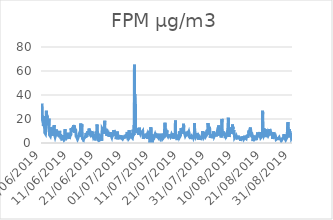
| Category | FPM |
|---|---|
| 01/06/2019 | 33 |
| 01/06/2019 | 28.8 |
| 01/06/2019 | 27.8 |
| 01/06/2019 | 22.1 |
| 01/06/2019 | 20 |
| 01/06/2019 | 18.8 |
| 01/06/2019 | 19.4 |
| 01/06/2019 | 20 |
| 01/06/2019 | 20.7 |
| 01/06/2019 | 17.9 |
| 01/06/2019 | 15 |
| 01/06/2019 | 14.5 |
| 01/06/2019 | 14.1 |
| 01/06/2019 | 14.8 |
| 01/06/2019 | 15.9 |
| 01/06/2019 | 16.6 |
| 01/06/2019 | 16.5 |
| 01/06/2019 | 17.1 |
| 01/06/2019 | 19.7 |
| 01/06/2019 | 20.4 |
| 01/06/2019 | 22.2 |
| 01/06/2019 | 17.9 |
| 01/06/2019 | 13.1 |
| 01/06/2019 | 11.6 |
| 02/06/2019 | 8.6 |
| 02/06/2019 | 7.8 |
| 02/06/2019 | 8.2 |
| 02/06/2019 | 9.4 |
| 02/06/2019 | 9.2 |
| 02/06/2019 | 8.2 |
| 02/06/2019 | 7.7 |
| 02/06/2019 | 8.7 |
| 02/06/2019 | 9.6 |
| 02/06/2019 | 10.2 |
| 02/06/2019 | 10 |
| 02/06/2019 | 12.8 |
| 02/06/2019 | 14.6 |
| 02/06/2019 | 18.4 |
| 02/06/2019 | 26.9 |
| 02/06/2019 | 25.3 |
| 02/06/2019 | 24.2 |
| 02/06/2019 | 22.9 |
| 02/06/2019 | 22.1 |
| 02/06/2019 | 21.6 |
| 02/06/2019 | 22.8 |
| 02/06/2019 | 22 |
| 02/06/2019 | 20.1 |
| 02/06/2019 | 19.1 |
| 03/06/2019 | 16 |
| 03/06/2019 | 15.2 |
| 03/06/2019 | 15.2 |
| 03/06/2019 | 15.3 |
| 03/06/2019 | 14.9 |
| 03/06/2019 | 14.8 |
| 03/06/2019 | 14.7 |
| 03/06/2019 | 14.7 |
| 03/06/2019 | 15.3 |
| 03/06/2019 | 14.3 |
| 03/06/2019 | 15 |
| 03/06/2019 | 18.9 |
| 03/06/2019 | 20.3 |
| 03/06/2019 | 14.6 |
| 03/06/2019 | 12.7 |
| 03/06/2019 | 13.3 |
| 03/06/2019 | 10.1 |
| 03/06/2019 | 8.6 |
| 03/06/2019 | 6.7 |
| 03/06/2019 | 6.5 |
| 03/06/2019 | 6.3 |
| 03/06/2019 | 6.5 |
| 03/06/2019 | 7.1 |
| 03/06/2019 | 7.4 |
| 04/06/2019 | 6.5 |
| 04/06/2019 | 5.7 |
| 04/06/2019 | 5.7 |
| 04/06/2019 | 6.6 |
| 04/06/2019 | 7.8 |
| 04/06/2019 | 11.2 |
| 04/06/2019 | 13.3 |
| 04/06/2019 | 13.5 |
| 04/06/2019 | 13.5 |
| 04/06/2019 | 11.9 |
| 04/06/2019 | 11 |
| 04/06/2019 | 10.7 |
| 04/06/2019 | 11.4 |
| 04/06/2019 | 8.5 |
| 04/06/2019 | 8.2 |
| 04/06/2019 | 10.9 |
| 04/06/2019 | 8.5 |
| 04/06/2019 | 7.4 |
| 04/06/2019 | 6.8 |
| 04/06/2019 | 6.1 |
| 04/06/2019 | 7 |
| 04/06/2019 | 6.9 |
| 04/06/2019 | 6.6 |
| 04/06/2019 | 6.7 |
| 05/06/2019 | 8.4 |
| 05/06/2019 | 12.5 |
| 05/06/2019 | 10.1 |
| 05/06/2019 | 9 |
| 05/06/2019 | 9.2 |
| 05/06/2019 | 9.1 |
| 05/06/2019 | 10.6 |
| 05/06/2019 | 11.1 |
| 05/06/2019 | 10.5 |
| 05/06/2019 | 10.4 |
| 05/06/2019 | 10.5 |
| 05/06/2019 | 14.9 |
| 05/06/2019 | 13.5 |
| 05/06/2019 | 9.4 |
| 05/06/2019 | 8.3 |
| 05/06/2019 | 7.4 |
| 05/06/2019 | 6.2 |
| 05/06/2019 | 5.7 |
| 05/06/2019 | 5.5 |
| 05/06/2019 | 5.1 |
| 05/06/2019 | 5.1 |
| 05/06/2019 | 5.8 |
| 05/06/2019 | 6.1 |
| 05/06/2019 | 6.5 |
| 06/06/2019 | 5.8 |
| 06/06/2019 | 6.1 |
| 06/06/2019 | 6.1 |
| 06/06/2019 | 6.4 |
| 06/06/2019 | 7.2 |
| 06/06/2019 | 8.6 |
| 06/06/2019 | 11.2 |
| 06/06/2019 | 12 |
| 06/06/2019 | 9.6 |
| 06/06/2019 | 7.1 |
| 06/06/2019 | 6.6 |
| 06/06/2019 | 6.9 |
| 06/06/2019 | 6.7 |
| 06/06/2019 | 7.3 |
| 06/06/2019 | 7.8 |
| 06/06/2019 | 7.6 |
| 06/06/2019 | 7.4 |
| 06/06/2019 | 6.7 |
| 06/06/2019 | 6.6 |
| 06/06/2019 | 7.8 |
| 06/06/2019 | 8 |
| 06/06/2019 | 7.3 |
| 06/06/2019 | 6.9 |
| 06/06/2019 | 6.5 |
| 07/06/2019 | 6.8 |
| 07/06/2019 | 9 |
| 07/06/2019 | 8.4 |
| 07/06/2019 | 7.6 |
| 07/06/2019 | 7.1 |
| 07/06/2019 | 7.7 |
| 07/06/2019 | 8.8 |
| 07/06/2019 | 8.2 |
| 07/06/2019 | 9.5 |
| 07/06/2019 | 8.5 |
| 07/06/2019 | 9.1 |
| 07/06/2019 | 10.1 |
| 07/06/2019 | 8.5 |
| 07/06/2019 | 5.7 |
| 07/06/2019 | 4.7 |
| 07/06/2019 | 4.5 |
| 07/06/2019 | 5.9 |
| 07/06/2019 | 7.4 |
| 07/06/2019 | 7.6 |
| 07/06/2019 | 6.3 |
| 07/06/2019 | 6.4 |
| 07/06/2019 | 5.7 |
| 07/06/2019 | 4.4 |
| 07/06/2019 | 3.2 |
| 08/06/2019 | 2.6 |
| 08/06/2019 | 2.8 |
| 08/06/2019 | 2.8 |
| 08/06/2019 | 4.1 |
| 08/06/2019 | 3.9 |
| 08/06/2019 | 3.2 |
| 08/06/2019 | 2.4 |
| 08/06/2019 | 2.6 |
| 08/06/2019 | 2.6 |
| 08/06/2019 | 3.6 |
| 08/06/2019 | 3.3 |
| 08/06/2019 | 3.6 |
| 08/06/2019 | 3.3 |
| 08/06/2019 | 3.2 |
| 08/06/2019 | 3.5 |
| 08/06/2019 | 4.2 |
| 08/06/2019 | 6.6 |
| 08/06/2019 | 4.8 |
| 08/06/2019 | 4.9 |
| 08/06/2019 | 5.2 |
| 08/06/2019 | 4.3 |
| 08/06/2019 | 3.7 |
| 08/06/2019 | 3.4 |
| 08/06/2019 | 3.2 |
| 09/06/2019 | 3.1 |
| 09/06/2019 | 2.7 |
| 09/06/2019 | 2.3 |
| 09/06/2019 | 2.6 |
| 09/06/2019 | 3.1 |
| 09/06/2019 | 2.9 |
| 09/06/2019 | 3.5 |
| 09/06/2019 | 3.7 |
| 09/06/2019 | 5.1 |
| 09/06/2019 | 11.5 |
| 09/06/2019 | 12.2 |
| 09/06/2019 | 10.6 |
| 09/06/2019 | 7.8 |
| 09/06/2019 | 7.4 |
| 09/06/2019 | 7.2 |
| 09/06/2019 | 7.1 |
| 09/06/2019 | 6.8 |
| 09/06/2019 | 6.6 |
| 09/06/2019 | 6.5 |
| 09/06/2019 | 6.4 |
| 09/06/2019 | 7.6 |
| 09/06/2019 | 7 |
| 09/06/2019 | 6.1 |
| 09/06/2019 | 4.1 |
| 10/06/2019 | 4.1 |
| 10/06/2019 | 4.2 |
| 10/06/2019 | 4.4 |
| 10/06/2019 | 3.8 |
| 10/06/2019 | 3.7 |
| 10/06/2019 | 3.7 |
| 10/06/2019 | 4.7 |
| 10/06/2019 | 5.1 |
| 10/06/2019 | 5.3 |
| 10/06/2019 | 8.5 |
| 10/06/2019 | 5.3 |
| 10/06/2019 | 4.8 |
| 10/06/2019 | 4.2 |
| 10/06/2019 | 4.2 |
| 10/06/2019 | 4.7 |
| 10/06/2019 | 4.3 |
| 10/06/2019 | 4.1 |
| 10/06/2019 | 4.6 |
| 10/06/2019 | 4.7 |
| 10/06/2019 | 6.1 |
| 10/06/2019 | 5.3 |
| 10/06/2019 | 4.4 |
| 10/06/2019 | 4.2 |
| 10/06/2019 | 3.4 |
| 11/06/2019 | 3.8 |
| 11/06/2019 | 4.2 |
| 11/06/2019 | 4.4 |
| 11/06/2019 | 4 |
| 11/06/2019 | 4.3 |
| 11/06/2019 | 4.7 |
| 11/06/2019 | 5.5 |
| 11/06/2019 | 6.5 |
| 11/06/2019 | 7.3 |
| 11/06/2019 | 6.8 |
| 11/06/2019 | 7.4 |
| 11/06/2019 | 6.2 |
| 11/06/2019 | 5.5 |
| 11/06/2019 | 8.4 |
| 11/06/2019 | 8.6 |
| 11/06/2019 | 8.7 |
| 11/06/2019 | 12.2 |
| 11/06/2019 | 11.2 |
| 11/06/2019 | 12.2 |
| 11/06/2019 | 10.9 |
| 11/06/2019 | 10.8 |
| 11/06/2019 | 9.3 |
| 11/06/2019 | 8.9 |
| 11/06/2019 | 9.5 |
| 12/06/2019 | 10.5 |
| 12/06/2019 | 10.8 |
| 12/06/2019 | 11.4 |
| 12/06/2019 | 11.8 |
| 12/06/2019 | 12.2 |
| 12/06/2019 | 12.9 |
| 12/06/2019 | 13.3 |
| 12/06/2019 | 12.9 |
| 12/06/2019 | 12.5 |
| 12/06/2019 | 11.8 |
| 12/06/2019 | 11.6 |
| 12/06/2019 | 13.6 |
| 12/06/2019 | 13.7 |
| 12/06/2019 | 12.5 |
| 12/06/2019 | 13.2 |
| 12/06/2019 | 14.7 |
| 12/06/2019 | 12.1 |
| 12/06/2019 | 14.6 |
| 12/06/2019 | 10.2 |
| 12/06/2019 | 8.6 |
| 12/06/2019 | 9.9 |
| 12/06/2019 | 9.3 |
| 12/06/2019 | 9.8 |
| 12/06/2019 | 10.2 |
| 13/06/2019 | 10.8 |
| 13/06/2019 | 11.9 |
| 13/06/2019 | 12 |
| 13/06/2019 | 12.3 |
| 13/06/2019 | 12.1 |
| 13/06/2019 | 11.7 |
| 13/06/2019 | 12.1 |
| 13/06/2019 | 12.1 |
| 13/06/2019 | 10.8 |
| 13/06/2019 | 10 |
| 13/06/2019 | 7.7 |
| 13/06/2019 | 6.7 |
| 13/06/2019 | 6.3 |
| 13/06/2019 | 4.9 |
| 13/06/2019 | 5 |
| 13/06/2019 | 4.4 |
| 13/06/2019 | 4.2 |
| 13/06/2019 | 4.6 |
| 13/06/2019 | 4.9 |
| 13/06/2019 | 6.7 |
| 13/06/2019 | 4.2 |
| 13/06/2019 | 3.9 |
| 13/06/2019 | 4 |
| 13/06/2019 | 4 |
| 14/06/2019 | 3.2 |
| 14/06/2019 | 3.2 |
| 14/06/2019 | 2.9 |
| 14/06/2019 | 3.3 |
| 14/06/2019 | 3.8 |
| 14/06/2019 | 4.4 |
| 14/06/2019 | 4.7 |
| 14/06/2019 | 5.2 |
| 14/06/2019 | 4.2 |
| 14/06/2019 | 4 |
| 14/06/2019 | 4.2 |
| 14/06/2019 | 6.1 |
| 14/06/2019 | 5.5 |
| 14/06/2019 | 5.2 |
| 14/06/2019 | 5.9 |
| 14/06/2019 | 5 |
| 14/06/2019 | 5.3 |
| 14/06/2019 | 6.7 |
| 14/06/2019 | 5.5 |
| 14/06/2019 | 6.1 |
| 14/06/2019 | 6.3 |
| 14/06/2019 | 7.9 |
| 14/06/2019 | 8.4 |
| 14/06/2019 | 5.6 |
| 15/06/2019 | 7.1 |
| 15/06/2019 | 9.5 |
| 15/06/2019 | 11 |
| 15/06/2019 | 13.8 |
| 15/06/2019 | 16.3 |
| 15/06/2019 | 12.8 |
| 15/06/2019 | 11.7 |
| 15/06/2019 | 12.7 |
| 15/06/2019 | 14.7 |
| 15/06/2019 | 13.1 |
| 15/06/2019 | 12.2 |
| 15/06/2019 | 9.9 |
| 15/06/2019 | 9.4 |
| 15/06/2019 | 15.6 |
| 15/06/2019 | 13.4 |
| 15/06/2019 | 12.1 |
| 15/06/2019 | 10.6 |
| 15/06/2019 | 7.4 |
| 15/06/2019 | 6 |
| 15/06/2019 | 3.7 |
| 15/06/2019 | 3.4 |
| 15/06/2019 | 4.3 |
| 15/06/2019 | 4.2 |
| 15/06/2019 | 4.1 |
| 16/06/2019 | 3.7 |
| 16/06/2019 | 3.7 |
| 16/06/2019 | 3.3 |
| 16/06/2019 | 2.8 |
| 16/06/2019 | 2.7 |
| 16/06/2019 | 3.4 |
| 16/06/2019 | 5 |
| 16/06/2019 | 3.6 |
| 16/06/2019 | 4 |
| 16/06/2019 | 3.5 |
| 16/06/2019 | 3.3 |
| 16/06/2019 | 3.6 |
| 16/06/2019 | 3.5 |
| 16/06/2019 | 3.6 |
| 16/06/2019 | 3.8 |
| 16/06/2019 | 4.5 |
| 16/06/2019 | 4.4 |
| 16/06/2019 | 4.9 |
| 16/06/2019 | 5.2 |
| 16/06/2019 | 4.9 |
| 16/06/2019 | 4.7 |
| 16/06/2019 | 5 |
| 16/06/2019 | 5.4 |
| 16/06/2019 | 4.6 |
| 17/06/2019 | 4.2 |
| 17/06/2019 | 5.3 |
| 17/06/2019 | 8.1 |
| 17/06/2019 | 8.2 |
| 17/06/2019 | 8.1 |
| 17/06/2019 | 7.2 |
| 17/06/2019 | 8.4 |
| 17/06/2019 | 7.8 |
| 17/06/2019 | 6.1 |
| 17/06/2019 | 5.2 |
| 17/06/2019 | 5 |
| 17/06/2019 | 5.9 |
| 17/06/2019 | 6.5 |
| 17/06/2019 | 6.3 |
| 17/06/2019 | 7.1 |
| 17/06/2019 | 7.8 |
| 17/06/2019 | 7.5 |
| 17/06/2019 | 7.3 |
| 17/06/2019 | 8.5 |
| 17/06/2019 | 9.8 |
| 17/06/2019 | 7.2 |
| 17/06/2019 | 7.2 |
| 17/06/2019 | 7.8 |
| 17/06/2019 | 8.1 |
| 18/06/2019 | 9.3 |
| 18/06/2019 | 7.7 |
| 18/06/2019 | 6.7 |
| 18/06/2019 | 8.1 |
| 18/06/2019 | 8.1 |
| 18/06/2019 | 10.2 |
| 18/06/2019 | 12 |
| 18/06/2019 | 11.4 |
| 18/06/2019 | 7.8 |
| 18/06/2019 | 7.3 |
| 18/06/2019 | 8.3 |
| 18/06/2019 | 8.2 |
| 18/06/2019 | 7.9 |
| 18/06/2019 | 7.9 |
| 18/06/2019 | 8 |
| 18/06/2019 | 6.9 |
| 18/06/2019 | 6.9 |
| 18/06/2019 | 6.7 |
| 18/06/2019 | 7.3 |
| 18/06/2019 | 8.9 |
| 18/06/2019 | 9.7 |
| 18/06/2019 | 9.5 |
| 18/06/2019 | 8.7 |
| 18/06/2019 | 8.5 |
| 19/06/2019 | 8 |
| 19/06/2019 | 8.6 |
| 19/06/2019 | 8.9 |
| 19/06/2019 | 8.9 |
| 19/06/2019 | 9.1 |
| 19/06/2019 | 9 |
| 19/06/2019 | 10 |
| 19/06/2019 | 10.3 |
| 19/06/2019 | 8.1 |
| 19/06/2019 | 7.2 |
| 19/06/2019 | 8 |
| 19/06/2019 | 7.3 |
| 19/06/2019 | 7.4 |
| 19/06/2019 | 7.2 |
| 19/06/2019 | 8.8 |
| 19/06/2019 | 7.6 |
| 19/06/2019 | 6.7 |
| 19/06/2019 | 6.6 |
| 19/06/2019 | 5.8 |
| 19/06/2019 | 5.1 |
| 19/06/2019 | 5.2 |
| 19/06/2019 | 6.1 |
| 19/06/2019 | 6.8 |
| 19/06/2019 | 5.2 |
| 20/06/2019 | 4.3 |
| 20/06/2019 | 4.2 |
| 20/06/2019 | 4 |
| 20/06/2019 | 3.7 |
| 20/06/2019 | 5.1 |
| 20/06/2019 | 5.8 |
| 20/06/2019 | 7.3 |
| 20/06/2019 | 5.4 |
| 20/06/2019 | 3.2 |
| 20/06/2019 | 2.2 |
| 20/06/2019 | 1.8 |
| 20/06/2019 | 2 |
| 20/06/2019 | 2.9 |
| 20/06/2019 | 3 |
| 20/06/2019 | 4.6 |
| 20/06/2019 | 5.7 |
| 20/06/2019 | 5.4 |
| 20/06/2019 | 5.4 |
| 20/06/2019 | 6.1 |
| 20/06/2019 | 5.7 |
| 20/06/2019 | 6 |
| 20/06/2019 | 9.6 |
| 20/06/2019 | 8.4 |
| 20/06/2019 | 5.6 |
| 21/06/2019 | 5.5 |
| 21/06/2019 | 5.4 |
| 21/06/2019 | 6.4 |
| 21/06/2019 | 8.1 |
| 21/06/2019 | 15.4 |
| 21/06/2019 | 14 |
| 21/06/2019 | 10.8 |
| 21/06/2019 | 9.5 |
| 21/06/2019 | 6.6 |
| 21/06/2019 | 7.2 |
| 21/06/2019 | 8.3 |
| 21/06/2019 | 8.5 |
| 21/06/2019 | 7.7 |
| 21/06/2019 | 6.6 |
| 21/06/2019 | 7.5 |
| 21/06/2019 | 6.2 |
| 21/06/2019 | 3.5 |
| 21/06/2019 | 1.5 |
| 21/06/2019 | 2 |
| 21/06/2019 | 2.7 |
| 21/06/2019 | 3.7 |
| 21/06/2019 | 3.8 |
| 21/06/2019 | 2.3 |
| 21/06/2019 | 2.1 |
| 22/06/2019 | 2.2 |
| 22/06/2019 | 2.3 |
| 22/06/2019 | 2.6 |
| 22/06/2019 | 2.6 |
| 22/06/2019 | 2.4 |
| 22/06/2019 | 2.5 |
| 22/06/2019 | 2.4 |
| 22/06/2019 | 2.7 |
| 22/06/2019 | 2.5 |
| 22/06/2019 | 2.4 |
| 22/06/2019 | 2.9 |
| 22/06/2019 | 4.3 |
| 22/06/2019 | 4.5 |
| 22/06/2019 | 4.2 |
| 22/06/2019 | 3.8 |
| 22/06/2019 | 3.4 |
| 22/06/2019 | 5.3 |
| 22/06/2019 | 6.7 |
| 22/06/2019 | 4.1 |
| 22/06/2019 | 4 |
| 22/06/2019 | 1.9 |
| 22/06/2019 | 2.1 |
| 22/06/2019 | 4.8 |
| 22/06/2019 | 6.6 |
| 23/06/2019 | 9.1 |
| 23/06/2019 | 11.8 |
| 23/06/2019 | 12 |
| 23/06/2019 | 12.1 |
| 23/06/2019 | 12.5 |
| 23/06/2019 | 12.1 |
| 23/06/2019 | 12 |
| 23/06/2019 | 11.8 |
| 23/06/2019 | 10.7 |
| 23/06/2019 | 10 |
| 23/06/2019 | 8.8 |
| 23/06/2019 | 7.7 |
| 23/06/2019 | 8.4 |
| 23/06/2019 | 10.5 |
| 23/06/2019 | 11.6 |
| 23/06/2019 | 11.7 |
| 23/06/2019 | 11.9 |
| 23/06/2019 | 11.2 |
| 23/06/2019 | 10.3 |
| 23/06/2019 | 9.9 |
| 23/06/2019 | 11.7 |
| 23/06/2019 | 12 |
| 23/06/2019 | 16.7 |
| 23/06/2019 | 18.5 |
| 24/06/2019 | 15 |
| 24/06/2019 | 11.6 |
| 24/06/2019 | 10.3 |
| 24/06/2019 | 10.4 |
| 24/06/2019 | 10.4 |
| 24/06/2019 | 8.3 |
| 24/06/2019 | 8.6 |
| 24/06/2019 | 10.6 |
| 24/06/2019 | 9.7 |
| 24/06/2019 | 9.9 |
| 24/06/2019 | 7.9 |
| 24/06/2019 | 8.3 |
| 24/06/2019 | 9.7 |
| 24/06/2019 | 11.8 |
| 24/06/2019 | 9.4 |
| 24/06/2019 | 8.3 |
| 24/06/2019 | 7.2 |
| 24/06/2019 | 5.9 |
| 24/06/2019 | 5.5 |
| 24/06/2019 | 6.4 |
| 24/06/2019 | 6.5 |
| 24/06/2019 | 6.6 |
| 24/06/2019 | 6.6 |
| 24/06/2019 | 7.7 |
| 25/06/2019 | 8.4 |
| 25/06/2019 | 8.4 |
| 25/06/2019 | 7.5 |
| 25/06/2019 | 7 |
| 25/06/2019 | 6.7 |
| 25/06/2019 | 6.2 |
| 25/06/2019 | 5.8 |
| 25/06/2019 | 5.6 |
| 25/06/2019 | 6.2 |
| 25/06/2019 | 6.6 |
| 25/06/2019 | 7.1 |
| 25/06/2019 | 7.7 |
| 25/06/2019 | 6.8 |
| 25/06/2019 | 6.5 |
| 25/06/2019 | 7 |
| 25/06/2019 | 5.3 |
| 25/06/2019 | 5 |
| 25/06/2019 | 4.8 |
| 25/06/2019 | 5.5 |
| 25/06/2019 | 5.1 |
| 25/06/2019 | 5.7 |
| 25/06/2019 | 8.8 |
| 25/06/2019 | 8.5 |
| 25/06/2019 | 7.9 |
| 26/06/2019 | 7.8 |
| 26/06/2019 | 7.4 |
| 26/06/2019 | 5.7 |
| 26/06/2019 | 6.6 |
| 26/06/2019 | 8.9 |
| 26/06/2019 | 6.7 |
| 26/06/2019 | 7 |
| 26/06/2019 | 7.2 |
| 26/06/2019 | 8 |
| 26/06/2019 | 5.7 |
| 26/06/2019 | 5.1 |
| 26/06/2019 | 5.1 |
| 26/06/2019 | 5.1 |
| 26/06/2019 | 4.8 |
| 26/06/2019 | 5.1 |
| 26/06/2019 | 5.7 |
| 26/06/2019 | 5.5 |
| 26/06/2019 | 4.9 |
| 26/06/2019 | 5.4 |
| 26/06/2019 | 6.4 |
| 26/06/2019 | 7.3 |
| 26/06/2019 | 8.5 |
| 26/06/2019 | 8.9 |
| 26/06/2019 | 8.7 |
| 27/06/2019 | 8.1 |
| 27/06/2019 | 7 |
| 27/06/2019 | 7.6 |
| 27/06/2019 | 6.7 |
| 27/06/2019 | 6.8 |
| 27/06/2019 | 7 |
| 27/06/2019 | 7.3 |
| 27/06/2019 | 7.9 |
| 27/06/2019 | 10.9 |
| 27/06/2019 | 9 |
| 27/06/2019 | 9.6 |
| 27/06/2019 | 10.2 |
| 27/06/2019 | 10.2 |
| 27/06/2019 | 8.1 |
| 27/06/2019 | 7.1 |
| 27/06/2019 | 6.4 |
| 27/06/2019 | 6.2 |
| 27/06/2019 | 7.2 |
| 27/06/2019 | 6.8 |
| 27/06/2019 | 7.4 |
| 27/06/2019 | 7.6 |
| 27/06/2019 | 8.3 |
| 27/06/2019 | 7.3 |
| 27/06/2019 | 7 |
| 28/06/2019 | 7 |
| 28/06/2019 | 6.4 |
| 28/06/2019 | 6.3 |
| 28/06/2019 | 3.2 |
| 28/06/2019 | 3.8 |
| 28/06/2019 | 3.4 |
| 28/06/2019 | 3.9 |
| 28/06/2019 | 4.4 |
| 28/06/2019 | 5.2 |
| 28/06/2019 | 6 |
| 28/06/2019 | 4.9 |
| 28/06/2019 | 5.1 |
| 28/06/2019 | 5.3 |
| 28/06/2019 | 5.3 |
| 28/06/2019 | 5.8 |
| 28/06/2019 | 6.4 |
| 28/06/2019 | 9.5 |
| 28/06/2019 | 5.3 |
| 28/06/2019 | 5 |
| 28/06/2019 | 5.3 |
| 28/06/2019 | 5.3 |
| 28/06/2019 | 5.4 |
| 28/06/2019 | 5 |
| 28/06/2019 | 4.8 |
| 29/06/2019 | 4.5 |
| 29/06/2019 | 4.7 |
| 29/06/2019 | 5.5 |
| 29/06/2019 | 4.7 |
| 29/06/2019 | 4 |
| 29/06/2019 | 4.3 |
| 29/06/2019 | 3.3 |
| 29/06/2019 | 3.1 |
| 29/06/2019 | 3.7 |
| 29/06/2019 | 6.1 |
| 29/06/2019 | 6.9 |
| 29/06/2019 | 4.8 |
| 29/06/2019 | 4.4 |
| 29/06/2019 | 3.5 |
| 29/06/2019 | 4.1 |
| 29/06/2019 | 4.2 |
| 29/06/2019 | 4 |
| 29/06/2019 | 4.8 |
| 29/06/2019 | 5.1 |
| 29/06/2019 | 4.7 |
| 29/06/2019 | 4.3 |
| 29/06/2019 | 4.3 |
| 29/06/2019 | 4.1 |
| 29/06/2019 | 5 |
| 30/06/2019 | 6.5 |
| 30/06/2019 | 4.2 |
| 30/06/2019 | 4.3 |
| 30/06/2019 | 4.5 |
| 30/06/2019 | 4.3 |
| 30/06/2019 | 4.3 |
| 30/06/2019 | 3.8 |
| 30/06/2019 | 3.8 |
| 30/06/2019 | 3.6 |
| 30/06/2019 | 3.6 |
| 30/06/2019 | 3.5 |
| 30/06/2019 | 3.4 |
| 30/06/2019 | 3.3 |
| 30/06/2019 | 3.3 |
| 30/06/2019 | 3 |
| 30/06/2019 | 3.2 |
| 30/06/2019 | 5.4 |
| 30/06/2019 | 3.6 |
| 30/06/2019 | 3.7 |
| 30/06/2019 | 5.5 |
| 30/06/2019 | 4.5 |
| 30/06/2019 | 3.8 |
| 30/06/2019 | 3.8 |
| 30/06/2019 | 4 |
| 01/07/2019 | 4.7 |
| 01/07/2019 | 5.1 |
| 01/07/2019 | 5.3 |
| 01/07/2019 | 5.4 |
| 01/07/2019 | 5.1 |
| 01/07/2019 | 5.5 |
| 01/07/2019 | 5.5 |
| 01/07/2019 | 6 |
| 01/07/2019 | 6 |
| 01/07/2019 | 6.1 |
| 01/07/2019 | 5.8 |
| 01/07/2019 | 5.4 |
| 01/07/2019 | 5 |
| 01/07/2019 | 4.9 |
| 01/07/2019 | 4.9 |
| 01/07/2019 | 5.6 |
| 01/07/2019 | 5.3 |
| 01/07/2019 | 5.6 |
| 01/07/2019 | 5.8 |
| 01/07/2019 | 6.3 |
| 01/07/2019 | 7.2 |
| 01/07/2019 | 7.9 |
| 01/07/2019 | 5.5 |
| 01/07/2019 | 6 |
| 02/07/2019 | 6.2 |
| 02/07/2019 | 6.1 |
| 02/07/2019 | 6.4 |
| 02/07/2019 | 6.1 |
| 02/07/2019 | 6.5 |
| 02/07/2019 | 8.3 |
| 02/07/2019 | 9.2 |
| 02/07/2019 | 5 |
| 02/07/2019 | 4.9 |
| 02/07/2019 | 4.2 |
| 02/07/2019 | 4 |
| 02/07/2019 | 3.7 |
| 02/07/2019 | 3.3 |
| 02/07/2019 | 3.6 |
| 02/07/2019 | 4 |
| 02/07/2019 | 3.8 |
| 02/07/2019 | 4.1 |
| 02/07/2019 | 4.5 |
| 02/07/2019 | 4.5 |
| 02/07/2019 | 4.8 |
| 02/07/2019 | 4.9 |
| 02/07/2019 | 6.8 |
| 02/07/2019 | 10.7 |
| 02/07/2019 | 4.2 |
| 03/07/2019 | 4.4 |
| 03/07/2019 | 4.6 |
| 03/07/2019 | 4.4 |
| 03/07/2019 | 4.1 |
| 03/07/2019 | 4.2 |
| 03/07/2019 | 4.1 |
| 03/07/2019 | 4.4 |
| 03/07/2019 | 4.7 |
| 03/07/2019 | 5.3 |
| 03/07/2019 | 5.2 |
| 03/07/2019 | 4.3 |
| 03/07/2019 | 5.7 |
| 03/07/2019 | 4.9 |
| 03/07/2019 | 5.2 |
| 03/07/2019 | 8.2 |
| 03/07/2019 | 6 |
| 03/07/2019 | 5.8 |
| 03/07/2019 | 5.3 |
| 03/07/2019 | 5.2 |
| 03/07/2019 | 5.1 |
| 03/07/2019 | 5.4 |
| 03/07/2019 | 5.2 |
| 03/07/2019 | 4.7 |
| 03/07/2019 | 4.7 |
| 04/07/2019 | 4.9 |
| 04/07/2019 | 4.4 |
| 04/07/2019 | 4.5 |
| 04/07/2019 | 4.2 |
| 04/07/2019 | 4.6 |
| 04/07/2019 | 5.2 |
| 04/07/2019 | 5.5 |
| 04/07/2019 | 6.7 |
| 04/07/2019 | 6.5 |
| 04/07/2019 | 11 |
| 04/07/2019 | 6.4 |
| 04/07/2019 | 6.2 |
| 04/07/2019 | 6.6 |
| 04/07/2019 | 6.5 |
| 04/07/2019 | 7.1 |
| 04/07/2019 | 7.8 |
| 04/07/2019 | 6.7 |
| 04/07/2019 | 7 |
| 04/07/2019 | 9.3 |
| 04/07/2019 | 15 |
| 04/07/2019 | 9.1 |
| 04/07/2019 | 65.3 |
| 04/07/2019 | 11.1 |
| 04/07/2019 | 38 |
| 05/07/2019 | 40.8 |
| 05/07/2019 | 14.7 |
| 05/07/2019 | 25 |
| 05/07/2019 | 16.6 |
| 05/07/2019 | 32.2 |
| 05/07/2019 | 22.3 |
| 05/07/2019 | 10.1 |
| 05/07/2019 | 8.9 |
| 05/07/2019 | 8.8 |
| 05/07/2019 | 8.9 |
| 05/07/2019 | 10.7 |
| 05/07/2019 | 8.3 |
| 05/07/2019 | 8.4 |
| 05/07/2019 | 9.3 |
| 05/07/2019 | 9 |
| 05/07/2019 | 9.5 |
| 05/07/2019 | 8.9 |
| 05/07/2019 | 9.3 |
| 05/07/2019 | 9.4 |
| 05/07/2019 | 8.5 |
| 05/07/2019 | 9.9 |
| 05/07/2019 | 9.3 |
| 05/07/2019 | 9.8 |
| 05/07/2019 | 12.2 |
| 06/07/2019 | 12.5 |
| 06/07/2019 | 11.2 |
| 06/07/2019 | 10.3 |
| 06/07/2019 | 9.5 |
| 06/07/2019 | 8.9 |
| 06/07/2019 | 8.6 |
| 06/07/2019 | 8.9 |
| 06/07/2019 | 8 |
| 06/07/2019 | 7.3 |
| 06/07/2019 | 6.9 |
| 06/07/2019 | 7.5 |
| 06/07/2019 | 7.4 |
| 06/07/2019 | 8.1 |
| 06/07/2019 | 9 |
| 06/07/2019 | 10.8 |
| 06/07/2019 | 11.2 |
| 06/07/2019 | 12.8 |
| 06/07/2019 | 9.3 |
| 06/07/2019 | 7.8 |
| 06/07/2019 | 7.5 |
| 06/07/2019 | 7.7 |
| 06/07/2019 | 7.7 |
| 06/07/2019 | 8.9 |
| 06/07/2019 | 8.7 |
| 07/07/2019 | 8.8 |
| 07/07/2019 | 8 |
| 07/07/2019 | 8 |
| 07/07/2019 | 8.3 |
| 07/07/2019 | 8.4 |
| 07/07/2019 | 8.6 |
| 07/07/2019 | 8.6 |
| 07/07/2019 | 9.7 |
| 07/07/2019 | 9.6 |
| 07/07/2019 | 8.6 |
| 07/07/2019 | 8.5 |
| 07/07/2019 | 7.5 |
| 07/07/2019 | 8 |
| 07/07/2019 | 8.9 |
| 07/07/2019 | 8.9 |
| 07/07/2019 | 9.2 |
| 07/07/2019 | 9.1 |
| 07/07/2019 | 9.2 |
| 07/07/2019 | 9 |
| 07/07/2019 | 9.2 |
| 07/07/2019 | 9.4 |
| 07/07/2019 | 9.9 |
| 07/07/2019 | 7.4 |
| 07/07/2019 | 6.2 |
| 08/07/2019 | 6.8 |
| 08/07/2019 | 6.5 |
| 08/07/2019 | 4.7 |
| 08/07/2019 | 3.5 |
| 08/07/2019 | 3.6 |
| 08/07/2019 | 4.2 |
| 08/07/2019 | 4.4 |
| 08/07/2019 | 4.4 |
| 08/07/2019 | 4.4 |
| 08/07/2019 | 4.5 |
| 08/07/2019 | 4.7 |
| 08/07/2019 | 5.1 |
| 08/07/2019 | 5 |
| 08/07/2019 | 5.3 |
| 08/07/2019 | 5.3 |
| 08/07/2019 | 5.5 |
| 08/07/2019 | 6 |
| 08/07/2019 | 6.7 |
| 08/07/2019 | 6.6 |
| 08/07/2019 | 6.7 |
| 08/07/2019 | 6.6 |
| 08/07/2019 | 6.5 |
| 08/07/2019 | 6.7 |
| 08/07/2019 | 6.8 |
| 09/07/2019 | 7.1 |
| 09/07/2019 | 7 |
| 09/07/2019 | 6.9 |
| 09/07/2019 | 6.3 |
| 09/07/2019 | 6.5 |
| 09/07/2019 | 6.4 |
| 09/07/2019 | 6.6 |
| 09/07/2019 | 6.6 |
| 09/07/2019 | 7 |
| 09/07/2019 | 7.1 |
| 09/07/2019 | 4.1 |
| 09/07/2019 | 6.1 |
| 09/07/2019 | 6.4 |
| 09/07/2019 | 5.9 |
| 09/07/2019 | 4.4 |
| 09/07/2019 | 3.5 |
| 09/07/2019 | 3.6 |
| 09/07/2019 | 3.9 |
| 09/07/2019 | 4 |
| 09/07/2019 | 6.7 |
| 09/07/2019 | 7.8 |
| 09/07/2019 | 8.6 |
| 09/07/2019 | 9.5 |
| 09/07/2019 | 8.2 |
| 10/07/2019 | 6.4 |
| 10/07/2019 | 8.4 |
| 10/07/2019 | 8.8 |
| 10/07/2019 | 9 |
| 10/07/2019 | 8.9 |
| 10/07/2019 | 9.1 |
| 10/07/2019 | 8.8 |
| 10/07/2019 | 8.4 |
| 10/07/2019 | 8.1 |
| 10/07/2019 | 7.5 |
| 10/07/2019 | 7.1 |
| 10/07/2019 | 6.8 |
| 10/07/2019 | 7 |
| 10/07/2019 | 7.1 |
| 10/07/2019 | 0 |
| 10/07/2019 | 0 |
| 10/07/2019 | 0 |
| 10/07/2019 | 6.3 |
| 10/07/2019 | 6.5 |
| 10/07/2019 | 6.3 |
| 10/07/2019 | 7.4 |
| 10/07/2019 | 13.2 |
| 10/07/2019 | 13.2 |
| 10/07/2019 | 6.4 |
| 11/07/2019 | 6.5 |
| 11/07/2019 | 6.7 |
| 11/07/2019 | 7 |
| 11/07/2019 | 7.3 |
| 11/07/2019 | 7.3 |
| 11/07/2019 | 7.4 |
| 11/07/2019 | 7.1 |
| 11/07/2019 | 6.9 |
| 11/07/2019 | 6.9 |
| 11/07/2019 | 7 |
| 11/07/2019 | 7.1 |
| 11/07/2019 | 0 |
| 11/07/2019 | 5.6 |
| 11/07/2019 | 5.5 |
| 11/07/2019 | 5.2 |
| 11/07/2019 | 4.9 |
| 11/07/2019 | 4.6 |
| 11/07/2019 | 4.3 |
| 11/07/2019 | 4.8 |
| 11/07/2019 | 5.4 |
| 11/07/2019 | 5.1 |
| 11/07/2019 | 7 |
| 11/07/2019 | 6.1 |
| 11/07/2019 | 5.8 |
| 12/07/2019 | 6 |
| 12/07/2019 | 6 |
| 12/07/2019 | 5.3 |
| 12/07/2019 | 5.2 |
| 12/07/2019 | 5.4 |
| 12/07/2019 | 6 |
| 12/07/2019 | 6.2 |
| 12/07/2019 | 5.9 |
| 12/07/2019 | 6.4 |
| 12/07/2019 | 6.6 |
| 12/07/2019 | 7.2 |
| 12/07/2019 | 6.6 |
| 12/07/2019 | 6.9 |
| 12/07/2019 | 6.3 |
| 12/07/2019 | 6 |
| 12/07/2019 | 6.2 |
| 12/07/2019 | 7 |
| 12/07/2019 | 5.7 |
| 12/07/2019 | 5.2 |
| 12/07/2019 | 5.7 |
| 12/07/2019 | 7.6 |
| 12/07/2019 | 6.8 |
| 12/07/2019 | 5.9 |
| 12/07/2019 | 6.2 |
| 13/07/2019 | 6 |
| 13/07/2019 | 6.6 |
| 13/07/2019 | 6.7 |
| 13/07/2019 | 6.7 |
| 13/07/2019 | 6.6 |
| 13/07/2019 | 4.3 |
| 13/07/2019 | 5.5 |
| 13/07/2019 | 5 |
| 13/07/2019 | 5 |
| 13/07/2019 | 5.8 |
| 13/07/2019 | 5.7 |
| 13/07/2019 | 5.2 |
| 13/07/2019 | 4.8 |
| 13/07/2019 | 4.9 |
| 13/07/2019 | 4.5 |
| 13/07/2019 | 5.2 |
| 13/07/2019 | 6.1 |
| 13/07/2019 | 5 |
| 13/07/2019 | 4.7 |
| 13/07/2019 | 4.3 |
| 13/07/2019 | 5.8 |
| 13/07/2019 | 7.7 |
| 13/07/2019 | 6.2 |
| 13/07/2019 | 5.2 |
| 14/07/2019 | 6.3 |
| 14/07/2019 | 5.5 |
| 14/07/2019 | 5.7 |
| 14/07/2019 | 4.8 |
| 14/07/2019 | 4.8 |
| 14/07/2019 | 5 |
| 14/07/2019 | 4.9 |
| 14/07/2019 | 4.2 |
| 14/07/2019 | 3.9 |
| 14/07/2019 | 3.9 |
| 14/07/2019 | 3.8 |
| 14/07/2019 | 4.5 |
| 14/07/2019 | 3.7 |
| 14/07/2019 | 4.5 |
| 14/07/2019 | 5.9 |
| 14/07/2019 | 4.6 |
| 14/07/2019 | 3.8 |
| 14/07/2019 | 4 |
| 14/07/2019 | 3.8 |
| 14/07/2019 | 3.9 |
| 14/07/2019 | 5.7 |
| 14/07/2019 | 6.5 |
| 14/07/2019 | 7.8 |
| 14/07/2019 | 6.4 |
| 15/07/2019 | 4.5 |
| 15/07/2019 | 4.6 |
| 15/07/2019 | 3.9 |
| 15/07/2019 | 3.3 |
| 15/07/2019 | 2.9 |
| 15/07/2019 | 4 |
| 15/07/2019 | 3.6 |
| 15/07/2019 | 3.6 |
| 15/07/2019 | 3.9 |
| 15/07/2019 | 3.8 |
| 15/07/2019 | 3.8 |
| 15/07/2019 | 4.2 |
| 15/07/2019 | 3.9 |
| 15/07/2019 | 4.1 |
| 15/07/2019 | 4.5 |
| 15/07/2019 | 5.3 |
| 15/07/2019 | 5.2 |
| 15/07/2019 | 5.1 |
| 15/07/2019 | 5.9 |
| 15/07/2019 | 6 |
| 15/07/2019 | 6.8 |
| 15/07/2019 | 9.4 |
| 15/07/2019 | 11.5 |
| 15/07/2019 | 7.4 |
| 16/07/2019 | 8.9 |
| 16/07/2019 | 16.9 |
| 16/07/2019 | 12.7 |
| 16/07/2019 | 11.1 |
| 16/07/2019 | 10.3 |
| 16/07/2019 | 9.8 |
| 16/07/2019 | 10.1 |
| 16/07/2019 | 12 |
| 16/07/2019 | 8.8 |
| 16/07/2019 | 8.4 |
| 16/07/2019 | 7.3 |
| 16/07/2019 | 7.7 |
| 16/07/2019 | 7 |
| 16/07/2019 | 7 |
| 16/07/2019 | 7.8 |
| 16/07/2019 | 6.9 |
| 16/07/2019 | 8.1 |
| 16/07/2019 | 8.4 |
| 16/07/2019 | 10.5 |
| 16/07/2019 | 9.3 |
| 16/07/2019 | 7.5 |
| 16/07/2019 | 6.4 |
| 16/07/2019 | 6.2 |
| 16/07/2019 | 6.2 |
| 17/07/2019 | 6.1 |
| 17/07/2019 | 5.8 |
| 17/07/2019 | 5.8 |
| 17/07/2019 | 5.5 |
| 17/07/2019 | 5.3 |
| 17/07/2019 | 5.7 |
| 17/07/2019 | 5.5 |
| 17/07/2019 | 5.2 |
| 17/07/2019 | 5.4 |
| 17/07/2019 | 7.3 |
| 17/07/2019 | 7 |
| 17/07/2019 | 6.2 |
| 17/07/2019 | 5.7 |
| 17/07/2019 | 6.3 |
| 17/07/2019 | 6.5 |
| 17/07/2019 | 5.9 |
| 17/07/2019 | 6.8 |
| 17/07/2019 | 5.8 |
| 17/07/2019 | 5.6 |
| 17/07/2019 | 5.6 |
| 17/07/2019 | 6.3 |
| 17/07/2019 | 6.7 |
| 17/07/2019 | 6.6 |
| 17/07/2019 | 6.7 |
| 18/07/2019 | 6 |
| 18/07/2019 | 6 |
| 18/07/2019 | 5.1 |
| 18/07/2019 | 4.7 |
| 18/07/2019 | 5.1 |
| 18/07/2019 | 5.4 |
| 18/07/2019 | 5 |
| 18/07/2019 | 6 |
| 18/07/2019 | 5.6 |
| 18/07/2019 | 5.7 |
| 18/07/2019 | 5.8 |
| 18/07/2019 | 7.1 |
| 18/07/2019 | 7.3 |
| 18/07/2019 | 7 |
| 18/07/2019 | 6.4 |
| 18/07/2019 | 7.2 |
| 18/07/2019 | 6 |
| 18/07/2019 | 6.9 |
| 18/07/2019 | 6.4 |
| 18/07/2019 | 5.9 |
| 18/07/2019 | 8 |
| 18/07/2019 | 8.1 |
| 18/07/2019 | 4.7 |
| 18/07/2019 | 4.4 |
| 19/07/2019 | 3.8 |
| 19/07/2019 | 4.6 |
| 19/07/2019 | 5.2 |
| 19/07/2019 | 4.2 |
| 19/07/2019 | 4.5 |
| 19/07/2019 | 5.7 |
| 19/07/2019 | 5.7 |
| 19/07/2019 | 3.8 |
| 19/07/2019 | 3.8 |
| 19/07/2019 | 5.1 |
| 19/07/2019 | 5.4 |
| 19/07/2019 | 4.9 |
| 19/07/2019 | 4.9 |
| 19/07/2019 | 4.9 |
| 19/07/2019 | 4.5 |
| 19/07/2019 | 5.8 |
| 19/07/2019 | 6 |
| 19/07/2019 | 5.3 |
| 19/07/2019 | 5 |
| 19/07/2019 | 5.5 |
| 19/07/2019 | 6.6 |
| 19/07/2019 | 18.8 |
| 19/07/2019 | 9.5 |
| 19/07/2019 | 5.9 |
| 20/07/2019 | 4.6 |
| 20/07/2019 | 6.2 |
| 20/07/2019 | 5.8 |
| 20/07/2019 | 5.8 |
| 20/07/2019 | 5.9 |
| 20/07/2019 | 6.4 |
| 20/07/2019 | 6.2 |
| 20/07/2019 | 5 |
| 20/07/2019 | 3.5 |
| 20/07/2019 | 3.3 |
| 20/07/2019 | 3.1 |
| 20/07/2019 | 3.6 |
| 20/07/2019 | 3.2 |
| 20/07/2019 | 3.5 |
| 20/07/2019 | 3.7 |
| 20/07/2019 | 3.2 |
| 20/07/2019 | 2.7 |
| 20/07/2019 | 3.5 |
| 20/07/2019 | 3.7 |
| 20/07/2019 | 4.1 |
| 20/07/2019 | 4.9 |
| 20/07/2019 | 7 |
| 20/07/2019 | 7.8 |
| 20/07/2019 | 6.9 |
| 21/07/2019 | 5.1 |
| 21/07/2019 | 5.4 |
| 21/07/2019 | 6 |
| 21/07/2019 | 6 |
| 21/07/2019 | 5.8 |
| 21/07/2019 | 5.6 |
| 21/07/2019 | 5.3 |
| 21/07/2019 | 7 |
| 21/07/2019 | 9.7 |
| 21/07/2019 | 8 |
| 21/07/2019 | 6.4 |
| 21/07/2019 | 5.1 |
| 21/07/2019 | 4.9 |
| 21/07/2019 | 4.7 |
| 21/07/2019 | 4.7 |
| 21/07/2019 | 4.7 |
| 21/07/2019 | 5.3 |
| 21/07/2019 | 6.1 |
| 21/07/2019 | 6.7 |
| 21/07/2019 | 7.7 |
| 21/07/2019 | 8.6 |
| 21/07/2019 | 10.1 |
| 21/07/2019 | 11.5 |
| 21/07/2019 | 12.4 |
| 22/07/2019 | 12.3 |
| 22/07/2019 | 12.8 |
| 22/07/2019 | 12.7 |
| 22/07/2019 | 12 |
| 22/07/2019 | 10.2 |
| 22/07/2019 | 8 |
| 22/07/2019 | 8.5 |
| 22/07/2019 | 8.9 |
| 22/07/2019 | 8.5 |
| 22/07/2019 | 9.9 |
| 22/07/2019 | 9 |
| 22/07/2019 | 12.6 |
| 22/07/2019 | 10.3 |
| 22/07/2019 | 10 |
| 22/07/2019 | 9.2 |
| 22/07/2019 | 9.5 |
| 22/07/2019 | 8.5 |
| 22/07/2019 | 8.6 |
| 22/07/2019 | 9.2 |
| 22/07/2019 | 11.9 |
| 22/07/2019 | 13.3 |
| 22/07/2019 | 16.1 |
| 22/07/2019 | 12.9 |
| 22/07/2019 | 10.1 |
| 23/07/2019 | 9.7 |
| 23/07/2019 | 8.8 |
| 23/07/2019 | 8.1 |
| 23/07/2019 | 7.7 |
| 23/07/2019 | 7.1 |
| 23/07/2019 | 6.9 |
| 23/07/2019 | 7.5 |
| 23/07/2019 | 9.3 |
| 23/07/2019 | 9.6 |
| 23/07/2019 | 6.9 |
| 23/07/2019 | 6.2 |
| 23/07/2019 | 6.8 |
| 23/07/2019 | 5.9 |
| 23/07/2019 | 6.5 |
| 23/07/2019 | 6.3 |
| 23/07/2019 | 6.6 |
| 23/07/2019 | 6.6 |
| 23/07/2019 | 6.6 |
| 23/07/2019 | 7 |
| 23/07/2019 | 9.1 |
| 23/07/2019 | 7.6 |
| 23/07/2019 | 7.9 |
| 23/07/2019 | 6.6 |
| 23/07/2019 | 6.3 |
| 24/07/2019 | 6.3 |
| 24/07/2019 | 6.2 |
| 24/07/2019 | 6.4 |
| 24/07/2019 | 6.3 |
| 24/07/2019 | 6.3 |
| 24/07/2019 | 6.3 |
| 24/07/2019 | 7 |
| 24/07/2019 | 6.8 |
| 24/07/2019 | 7 |
| 24/07/2019 | 7.8 |
| 24/07/2019 | 7.6 |
| 24/07/2019 | 8 |
| 24/07/2019 | 8.9 |
| 24/07/2019 | 10.1 |
| 24/07/2019 | 9.7 |
| 24/07/2019 | 8.2 |
| 24/07/2019 | 7.9 |
| 24/07/2019 | 8.9 |
| 24/07/2019 | 8.8 |
| 24/07/2019 | 9.2 |
| 24/07/2019 | 9.2 |
| 24/07/2019 | 9.3 |
| 24/07/2019 | 8.6 |
| 24/07/2019 | 7.5 |
| 25/07/2019 | 4.6 |
| 25/07/2019 | 5.1 |
| 25/07/2019 | 5.4 |
| 25/07/2019 | 6.4 |
| 25/07/2019 | 6.6 |
| 25/07/2019 | 6.4 |
| 25/07/2019 | 5.6 |
| 25/07/2019 | 4.4 |
| 25/07/2019 | 3.6 |
| 25/07/2019 | 3.3 |
| 25/07/2019 | 3.5 |
| 25/07/2019 | 4.2 |
| 25/07/2019 | 3.5 |
| 25/07/2019 | 4.4 |
| 25/07/2019 | 4.7 |
| 25/07/2019 | 4.7 |
| 25/07/2019 | 4.6 |
| 25/07/2019 | 4.5 |
| 25/07/2019 | 5 |
| 25/07/2019 | 5.8 |
| 25/07/2019 | 5.4 |
| 25/07/2019 | 5.3 |
| 25/07/2019 | 5.3 |
| 25/07/2019 | 5.4 |
| 26/07/2019 | 5.1 |
| 26/07/2019 | 5.1 |
| 26/07/2019 | 4.9 |
| 26/07/2019 | 4.5 |
| 26/07/2019 | 4.8 |
| 26/07/2019 | 5 |
| 26/07/2019 | 4.4 |
| 26/07/2019 | 4.3 |
| 26/07/2019 | 4.7 |
| 26/07/2019 | 5.3 |
| 26/07/2019 | 5.4 |
| 26/07/2019 | 5.9 |
| 26/07/2019 | 5.8 |
| 26/07/2019 | 5.1 |
| 26/07/2019 | 4.6 |
| 26/07/2019 | 4.6 |
| 26/07/2019 | 5.1 |
| 26/07/2019 | 5.3 |
| 26/07/2019 | 5.4 |
| 26/07/2019 | 5.7 |
| 26/07/2019 | 9 |
| 26/07/2019 | 16.5 |
| 26/07/2019 | 12.1 |
| 26/07/2019 | 12.1 |
| 27/07/2019 | 9.9 |
| 27/07/2019 | 10 |
| 27/07/2019 | 8.9 |
| 27/07/2019 | 8.5 |
| 27/07/2019 | 7 |
| 27/07/2019 | 5.2 |
| 27/07/2019 | 6.3 |
| 27/07/2019 | 5.9 |
| 27/07/2019 | 5.5 |
| 27/07/2019 | 5.1 |
| 27/07/2019 | 4.5 |
| 27/07/2019 | 4.4 |
| 27/07/2019 | 4.5 |
| 27/07/2019 | 4.4 |
| 27/07/2019 | 4.4 |
| 27/07/2019 | 4.3 |
| 27/07/2019 | 5.1 |
| 27/07/2019 | 5.9 |
| 27/07/2019 | 6.9 |
| 27/07/2019 | 6.5 |
| 27/07/2019 | 7.2 |
| 27/07/2019 | 8.2 |
| 27/07/2019 | 7.5 |
| 27/07/2019 | 7.3 |
| 28/07/2019 | 6.9 |
| 28/07/2019 | 6.8 |
| 28/07/2019 | 7.4 |
| 28/07/2019 | 7.2 |
| 28/07/2019 | 6.4 |
| 28/07/2019 | 4.8 |
| 28/07/2019 | 4.5 |
| 28/07/2019 | 3.9 |
| 28/07/2019 | 2.8 |
| 28/07/2019 | 3.2 |
| 28/07/2019 | 3.2 |
| 28/07/2019 | 4.4 |
| 28/07/2019 | 5.8 |
| 28/07/2019 | 5.3 |
| 28/07/2019 | 5.2 |
| 28/07/2019 | 5.6 |
| 28/07/2019 | 6.2 |
| 28/07/2019 | 6.4 |
| 28/07/2019 | 6.3 |
| 28/07/2019 | 5.4 |
| 28/07/2019 | 4.7 |
| 28/07/2019 | 4.1 |
| 28/07/2019 | 4.3 |
| 28/07/2019 | 4.1 |
| 29/07/2019 | 3.8 |
| 29/07/2019 | 3.6 |
| 29/07/2019 | 3.5 |
| 29/07/2019 | 3.6 |
| 29/07/2019 | 3.7 |
| 29/07/2019 | 4.3 |
| 29/07/2019 | 4.3 |
| 29/07/2019 | 4.4 |
| 29/07/2019 | 4.2 |
| 29/07/2019 | 3.5 |
| 29/07/2019 | 3.6 |
| 29/07/2019 | 3.6 |
| 29/07/2019 | 3.8 |
| 29/07/2019 | 3.8 |
| 29/07/2019 | 3.8 |
| 29/07/2019 | 5 |
| 29/07/2019 | 6.1 |
| 29/07/2019 | 6.7 |
| 29/07/2019 | 7.3 |
| 29/07/2019 | 7.8 |
| 29/07/2019 | 9.8 |
| 29/07/2019 | 8.3 |
| 29/07/2019 | 7.6 |
| 29/07/2019 | 7.4 |
| 30/07/2019 | 5.7 |
| 30/07/2019 | 4.3 |
| 30/07/2019 | 4 |
| 30/07/2019 | 4 |
| 30/07/2019 | 3.6 |
| 30/07/2019 | 3.8 |
| 30/07/2019 | 4.7 |
| 30/07/2019 | 6.5 |
| 30/07/2019 | 6.8 |
| 30/07/2019 | 5.3 |
| 30/07/2019 | 5.3 |
| 30/07/2019 | 5.4 |
| 30/07/2019 | 5.5 |
| 30/07/2019 | 6.1 |
| 30/07/2019 | 6.2 |
| 30/07/2019 | 5.8 |
| 30/07/2019 | 6 |
| 30/07/2019 | 6.4 |
| 30/07/2019 | 7.6 |
| 30/07/2019 | 9.4 |
| 30/07/2019 | 6.3 |
| 30/07/2019 | 6.5 |
| 30/07/2019 | 5.8 |
| 30/07/2019 | 5.4 |
| 31/07/2019 | 5.5 |
| 31/07/2019 | 5.6 |
| 31/07/2019 | 5.5 |
| 31/07/2019 | 5.7 |
| 31/07/2019 | 5.8 |
| 31/07/2019 | 6 |
| 31/07/2019 | 6.5 |
| 31/07/2019 | 7.4 |
| 31/07/2019 | 6.8 |
| 31/07/2019 | 8.4 |
| 31/07/2019 | 7.4 |
| 31/07/2019 | 8.7 |
| 31/07/2019 | 11 |
| 31/07/2019 | 10.3 |
| 31/07/2019 | 8.1 |
| 31/07/2019 | 7.1 |
| 31/07/2019 | 7.5 |
| 31/07/2019 | 9.3 |
| 31/07/2019 | 10.1 |
| 31/07/2019 | 12.1 |
| 31/07/2019 | 16.7 |
| 31/07/2019 | 17.5 |
| 31/07/2019 | 13.2 |
| 31/07/2019 | 11.7 |
| 01/08/2019 | 10.4 |
| 01/08/2019 | 11.4 |
| 01/08/2019 | 11.4 |
| 01/08/2019 | 10.4 |
| 01/08/2019 | 9.6 |
| 01/08/2019 | 9.7 |
| 01/08/2019 | 10.5 |
| 01/08/2019 | 11.2 |
| 01/08/2019 | 13.4 |
| 01/08/2019 | 12.8 |
| 01/08/2019 | 12.4 |
| 01/08/2019 | 11.2 |
| 01/08/2019 | 10.2 |
| 01/08/2019 | 10.2 |
| 01/08/2019 | 9.2 |
| 01/08/2019 | 5.7 |
| 01/08/2019 | 4.4 |
| 01/08/2019 | 5.4 |
| 01/08/2019 | 6 |
| 01/08/2019 | 5.8 |
| 01/08/2019 | 6.1 |
| 01/08/2019 | 5.6 |
| 01/08/2019 | 5.6 |
| 01/08/2019 | 5.8 |
| 02/08/2019 | 5.2 |
| 02/08/2019 | 4.9 |
| 02/08/2019 | 5.1 |
| 02/08/2019 | 5.7 |
| 02/08/2019 | 6.1 |
| 02/08/2019 | 6.2 |
| 02/08/2019 | 6.4 |
| 02/08/2019 | 6.3 |
| 02/08/2019 | 6.1 |
| 02/08/2019 | 6.5 |
| 02/08/2019 | 6.9 |
| 02/08/2019 | 6.9 |
| 02/08/2019 | 6.3 |
| 02/08/2019 | 5.7 |
| 02/08/2019 | 5.8 |
| 02/08/2019 | 5.7 |
| 02/08/2019 | 5.8 |
| 02/08/2019 | 6 |
| 02/08/2019 | 6.9 |
| 02/08/2019 | 7.9 |
| 02/08/2019 | 9.7 |
| 02/08/2019 | 9.8 |
| 02/08/2019 | 8.5 |
| 02/08/2019 | 7.7 |
| 03/08/2019 | 7.7 |
| 03/08/2019 | 7.1 |
| 03/08/2019 | 6.4 |
| 03/08/2019 | 5.7 |
| 03/08/2019 | 5.6 |
| 03/08/2019 | 5.9 |
| 03/08/2019 | 5.7 |
| 03/08/2019 | 5.8 |
| 03/08/2019 | 6.4 |
| 03/08/2019 | 6.9 |
| 03/08/2019 | 6.7 |
| 03/08/2019 | 6.4 |
| 03/08/2019 | 6.3 |
| 03/08/2019 | 8.5 |
| 03/08/2019 | 8.1 |
| 03/08/2019 | 7.5 |
| 03/08/2019 | 7.8 |
| 03/08/2019 | 7.4 |
| 03/08/2019 | 6.5 |
| 03/08/2019 | 5.7 |
| 03/08/2019 | 5.5 |
| 03/08/2019 | 5.2 |
| 03/08/2019 | 5.4 |
| 03/08/2019 | 6 |
| 04/08/2019 | 7.6 |
| 04/08/2019 | 8.1 |
| 04/08/2019 | 8.3 |
| 04/08/2019 | 8.8 |
| 04/08/2019 | 8.5 |
| 04/08/2019 | 8.7 |
| 04/08/2019 | 9.2 |
| 04/08/2019 | 8.5 |
| 04/08/2019 | 7.3 |
| 04/08/2019 | 7.3 |
| 04/08/2019 | 7.4 |
| 04/08/2019 | 7.3 |
| 04/08/2019 | 6.1 |
| 04/08/2019 | 5.8 |
| 04/08/2019 | 5.7 |
| 04/08/2019 | 6 |
| 04/08/2019 | 6.5 |
| 04/08/2019 | 9.8 |
| 04/08/2019 | 8.4 |
| 04/08/2019 | 14.6 |
| 04/08/2019 | 11 |
| 04/08/2019 | 12.4 |
| 04/08/2019 | 10.2 |
| 04/08/2019 | 10 |
| 05/08/2019 | 9.5 |
| 05/08/2019 | 8.8 |
| 05/08/2019 | 8.6 |
| 05/08/2019 | 7.9 |
| 05/08/2019 | 7.7 |
| 05/08/2019 | 7.9 |
| 05/08/2019 | 8.2 |
| 05/08/2019 | 7.7 |
| 05/08/2019 | 7.1 |
| 05/08/2019 | 7.6 |
| 05/08/2019 | 7.6 |
| 05/08/2019 | 7.7 |
| 05/08/2019 | 6.4 |
| 05/08/2019 | 5.9 |
| 05/08/2019 | 5.5 |
| 05/08/2019 | 4.6 |
| 05/08/2019 | 4.4 |
| 05/08/2019 | 4.5 |
| 05/08/2019 | 4.8 |
| 05/08/2019 | 6.8 |
| 05/08/2019 | 9 |
| 05/08/2019 | 11.2 |
| 05/08/2019 | 20.1 |
| 05/08/2019 | 17.2 |
| 06/08/2019 | 11.4 |
| 06/08/2019 | 10.2 |
| 06/08/2019 | 7.5 |
| 06/08/2019 | 6.5 |
| 06/08/2019 | 7.1 |
| 06/08/2019 | 8.5 |
| 06/08/2019 | 9.6 |
| 06/08/2019 | 9.5 |
| 06/08/2019 | 8.7 |
| 06/08/2019 | 9.1 |
| 06/08/2019 | 9.6 |
| 06/08/2019 | 8.3 |
| 06/08/2019 | 8.3 |
| 06/08/2019 | 8.3 |
| 06/08/2019 | 7.6 |
| 06/08/2019 | 7.2 |
| 06/08/2019 | 6.2 |
| 06/08/2019 | 6.5 |
| 06/08/2019 | 6.3 |
| 06/08/2019 | 6 |
| 06/08/2019 | 6.7 |
| 06/08/2019 | 7.3 |
| 06/08/2019 | 8.5 |
| 06/08/2019 | 7.6 |
| 07/08/2019 | 5.9 |
| 07/08/2019 | 5.4 |
| 07/08/2019 | 4.9 |
| 07/08/2019 | 4.4 |
| 07/08/2019 | 4 |
| 07/08/2019 | 3.8 |
| 07/08/2019 | 4.1 |
| 07/08/2019 | 5.4 |
| 07/08/2019 | 6.8 |
| 07/08/2019 | 6.6 |
| 07/08/2019 | 6.4 |
| 07/08/2019 | 5.4 |
| 07/08/2019 | 5.4 |
| 07/08/2019 | 5.3 |
| 07/08/2019 | 5.3 |
| 07/08/2019 | 5.4 |
| 07/08/2019 | 5.1 |
| 07/08/2019 | 5.1 |
| 07/08/2019 | 5.5 |
| 07/08/2019 | 6.7 |
| 07/08/2019 | 8.8 |
| 07/08/2019 | 8.1 |
| 07/08/2019 | 8.4 |
| 07/08/2019 | 9.4 |
| 08/08/2019 | 8.9 |
| 08/08/2019 | 10.7 |
| 08/08/2019 | 10.8 |
| 08/08/2019 | 12.8 |
| 08/08/2019 | 12.6 |
| 08/08/2019 | 13 |
| 08/08/2019 | 13.6 |
| 08/08/2019 | 21.1 |
| 08/08/2019 | 12.5 |
| 08/08/2019 | 10.5 |
| 08/08/2019 | 7.1 |
| 08/08/2019 | 6.2 |
| 08/08/2019 | 6.1 |
| 08/08/2019 | 5.1 |
| 08/08/2019 | 5.7 |
| 08/08/2019 | 6.1 |
| 08/08/2019 | 5.8 |
| 08/08/2019 | 6.6 |
| 08/08/2019 | 6.7 |
| 08/08/2019 | 8.8 |
| 08/08/2019 | 10.2 |
| 08/08/2019 | 11.7 |
| 08/08/2019 | 13 |
| 08/08/2019 | 11.9 |
| 09/08/2019 | 11.9 |
| 09/08/2019 | 11.7 |
| 09/08/2019 | 9 |
| 09/08/2019 | 7.9 |
| 09/08/2019 | 7.3 |
| 09/08/2019 | 8 |
| 09/08/2019 | 7.2 |
| 09/08/2019 | 8.9 |
| 09/08/2019 | 8.8 |
| 09/08/2019 | 8.7 |
| 09/08/2019 | 7.6 |
| 09/08/2019 | 7.4 |
| 09/08/2019 | 7.7 |
| 09/08/2019 | 7.8 |
| 09/08/2019 | 8 |
| 09/08/2019 | 7.6 |
| 09/08/2019 | 7.5 |
| 09/08/2019 | 7.7 |
| 09/08/2019 | 8 |
| 09/08/2019 | 10.5 |
| 09/08/2019 | 15.5 |
| 09/08/2019 | 11.7 |
| 09/08/2019 | 13 |
| 09/08/2019 | 12.3 |
| 10/08/2019 | 12.1 |
| 10/08/2019 | 10.4 |
| 10/08/2019 | 10.3 |
| 10/08/2019 | 9.5 |
| 10/08/2019 | 10.6 |
| 10/08/2019 | 9.7 |
| 10/08/2019 | 10.8 |
| 10/08/2019 | 9.7 |
| 10/08/2019 | 9.6 |
| 10/08/2019 | 8.8 |
| 10/08/2019 | 8.2 |
| 10/08/2019 | 7.6 |
| 10/08/2019 | 7 |
| 10/08/2019 | 6 |
| 10/08/2019 | 4.7 |
| 10/08/2019 | 4.1 |
| 10/08/2019 | 4.7 |
| 10/08/2019 | 5.3 |
| 10/08/2019 | 4.9 |
| 10/08/2019 | 5.1 |
| 10/08/2019 | 5.7 |
| 10/08/2019 | 6.3 |
| 10/08/2019 | 6.6 |
| 10/08/2019 | 6.2 |
| 11/08/2019 | 5.6 |
| 11/08/2019 | 4.5 |
| 11/08/2019 | 4.7 |
| 11/08/2019 | 4.7 |
| 11/08/2019 | 5.1 |
| 11/08/2019 | 5.4 |
| 11/08/2019 | 5.3 |
| 11/08/2019 | 5.1 |
| 11/08/2019 | 4.7 |
| 11/08/2019 | 4 |
| 11/08/2019 | 3.7 |
| 11/08/2019 | 3.9 |
| 11/08/2019 | 4.1 |
| 11/08/2019 | 4 |
| 11/08/2019 | 3.9 |
| 11/08/2019 | 4.1 |
| 11/08/2019 | 4.3 |
| 11/08/2019 | 4.3 |
| 11/08/2019 | 4.3 |
| 11/08/2019 | 4.3 |
| 11/08/2019 | 4.9 |
| 11/08/2019 | 6.1 |
| 11/08/2019 | 5.9 |
| 11/08/2019 | 5.1 |
| 12/08/2019 | 4.7 |
| 12/08/2019 | 4.5 |
| 12/08/2019 | 4.5 |
| 12/08/2019 | 4.1 |
| 12/08/2019 | 3.9 |
| 12/08/2019 | 3.8 |
| 12/08/2019 | 3.9 |
| 12/08/2019 | 4.1 |
| 12/08/2019 | 4.4 |
| 12/08/2019 | 4 |
| 12/08/2019 | 3.8 |
| 12/08/2019 | 3.7 |
| 12/08/2019 | 3.8 |
| 12/08/2019 | 4 |
| 12/08/2019 | 3.6 |
| 12/08/2019 | 3.3 |
| 12/08/2019 | 3.9 |
| 12/08/2019 | 3.6 |
| 12/08/2019 | 2.9 |
| 12/08/2019 | 1.7 |
| 12/08/2019 | 1.5 |
| 12/08/2019 | 2.1 |
| 12/08/2019 | 3.3 |
| 12/08/2019 | 3.5 |
| 13/08/2019 | 3.6 |
| 13/08/2019 | 3.5 |
| 13/08/2019 | 3.8 |
| 13/08/2019 | 4.4 |
| 13/08/2019 | 5.5 |
| 13/08/2019 | 5.7 |
| 13/08/2019 | 5.4 |
| 13/08/2019 | 4.8 |
| 13/08/2019 | 4.2 |
| 13/08/2019 | 4.3 |
| 13/08/2019 | 4.2 |
| 13/08/2019 | 4 |
| 13/08/2019 | 3.6 |
| 13/08/2019 | 3.5 |
| 13/08/2019 | 3.4 |
| 13/08/2019 | 3.5 |
| 13/08/2019 | 3.6 |
| 13/08/2019 | 3.6 |
| 13/08/2019 | 3.5 |
| 13/08/2019 | 3.6 |
| 13/08/2019 | 4.5 |
| 13/08/2019 | 5.8 |
| 13/08/2019 | 6.2 |
| 13/08/2019 | 4.8 |
| 14/08/2019 | 4.3 |
| 14/08/2019 | 3.8 |
| 14/08/2019 | 3.8 |
| 14/08/2019 | 3.8 |
| 14/08/2019 | 4 |
| 14/08/2019 | 4.4 |
| 14/08/2019 | 4.7 |
| 14/08/2019 | 6.1 |
| 14/08/2019 | 5.1 |
| 14/08/2019 | 4.7 |
| 14/08/2019 | 4.2 |
| 14/08/2019 | 3.8 |
| 14/08/2019 | 3.4 |
| 14/08/2019 | 4 |
| 14/08/2019 | 3.4 |
| 14/08/2019 | 3.4 |
| 14/08/2019 | 4.2 |
| 14/08/2019 | 3.6 |
| 14/08/2019 | 3.7 |
| 14/08/2019 | 3.6 |
| 14/08/2019 | 3.6 |
| 14/08/2019 | 3.8 |
| 14/08/2019 | 5 |
| 14/08/2019 | 4.3 |
| 15/08/2019 | 5.2 |
| 15/08/2019 | 5.8 |
| 15/08/2019 | 5.8 |
| 15/08/2019 | 5.9 |
| 15/08/2019 | 5.8 |
| 15/08/2019 | 5.6 |
| 15/08/2019 | 5.9 |
| 15/08/2019 | 6.8 |
| 15/08/2019 | 6.4 |
| 15/08/2019 | 4.5 |
| 15/08/2019 | 4.3 |
| 15/08/2019 | 4.6 |
| 15/08/2019 | 6 |
| 15/08/2019 | 6.8 |
| 15/08/2019 | 6.6 |
| 15/08/2019 | 6.3 |
| 15/08/2019 | 6.1 |
| 15/08/2019 | 7.5 |
| 15/08/2019 | 7.6 |
| 15/08/2019 | 8.8 |
| 15/08/2019 | 10.4 |
| 15/08/2019 | 11 |
| 15/08/2019 | 7.9 |
| 15/08/2019 | 8.5 |
| 16/08/2019 | 8.6 |
| 16/08/2019 | 9.3 |
| 16/08/2019 | 10.3 |
| 16/08/2019 | 10.4 |
| 16/08/2019 | 10.2 |
| 16/08/2019 | 11.8 |
| 16/08/2019 | 11.3 |
| 16/08/2019 | 11.4 |
| 16/08/2019 | 12.1 |
| 16/08/2019 | 12.9 |
| 16/08/2019 | 12.4 |
| 16/08/2019 | 10.8 |
| 16/08/2019 | 7.5 |
| 16/08/2019 | 7.3 |
| 16/08/2019 | 5.7 |
| 16/08/2019 | 6.4 |
| 16/08/2019 | 7 |
| 16/08/2019 | 7.1 |
| 16/08/2019 | 8.6 |
| 16/08/2019 | 9.1 |
| 16/08/2019 | 6.9 |
| 16/08/2019 | 6.6 |
| 16/08/2019 | 4.7 |
| 16/08/2019 | 4.6 |
| 17/08/2019 | 4.5 |
| 17/08/2019 | 5.3 |
| 17/08/2019 | 5.6 |
| 17/08/2019 | 5.6 |
| 17/08/2019 | 4.8 |
| 17/08/2019 | 4.2 |
| 17/08/2019 | 2.6 |
| 17/08/2019 | 1.6 |
| 17/08/2019 | 1.3 |
| 17/08/2019 | 1.9 |
| 17/08/2019 | 1.5 |
| 17/08/2019 | 2.2 |
| 17/08/2019 | 3.1 |
| 17/08/2019 | 2.1 |
| 17/08/2019 | 3.3 |
| 17/08/2019 | 3.9 |
| 17/08/2019 | 4.2 |
| 17/08/2019 | 4 |
| 17/08/2019 | 3.5 |
| 17/08/2019 | 3.8 |
| 17/08/2019 | 4.9 |
| 17/08/2019 | 6.2 |
| 17/08/2019 | 6.7 |
| 17/08/2019 | 4.3 |
| 18/08/2019 | 3.6 |
| 18/08/2019 | 4 |
| 18/08/2019 | 3.6 |
| 18/08/2019 | 3.5 |
| 18/08/2019 | 3.6 |
| 18/08/2019 | 3.5 |
| 18/08/2019 | 3.3 |
| 18/08/2019 | 3 |
| 18/08/2019 | 3.4 |
| 18/08/2019 | 3.3 |
| 18/08/2019 | 2.9 |
| 18/08/2019 | 3 |
| 18/08/2019 | 2.9 |
| 18/08/2019 | 2.8 |
| 18/08/2019 | 3.3 |
| 18/08/2019 | 3.4 |
| 18/08/2019 | 3.6 |
| 18/08/2019 | 3.7 |
| 18/08/2019 | 4.2 |
| 18/08/2019 | 5 |
| 18/08/2019 | 5.1 |
| 18/08/2019 | 5.9 |
| 18/08/2019 | 5.9 |
| 18/08/2019 | 8.8 |
| 19/08/2019 | 7.9 |
| 19/08/2019 | 6.2 |
| 19/08/2019 | 5.8 |
| 19/08/2019 | 5.8 |
| 19/08/2019 | 5.1 |
| 19/08/2019 | 5.1 |
| 19/08/2019 | 7 |
| 19/08/2019 | 6.5 |
| 19/08/2019 | 6.6 |
| 19/08/2019 | 6 |
| 19/08/2019 | 5.6 |
| 19/08/2019 | 4.8 |
| 19/08/2019 | 4.5 |
| 19/08/2019 | 4.9 |
| 19/08/2019 | 5.6 |
| 19/08/2019 | 6.5 |
| 19/08/2019 | 6.8 |
| 19/08/2019 | 6.7 |
| 19/08/2019 | 6.6 |
| 19/08/2019 | 6.2 |
| 19/08/2019 | 6.4 |
| 19/08/2019 | 9.2 |
| 19/08/2019 | 7 |
| 19/08/2019 | 5.7 |
| 20/08/2019 | 6.1 |
| 20/08/2019 | 5.8 |
| 20/08/2019 | 5.1 |
| 20/08/2019 | 4.3 |
| 20/08/2019 | 4 |
| 20/08/2019 | 4.3 |
| 20/08/2019 | 4.7 |
| 20/08/2019 | 4 |
| 20/08/2019 | 4.2 |
| 20/08/2019 | 4.5 |
| 20/08/2019 | 5 |
| 20/08/2019 | 5.3 |
| 20/08/2019 | 5.2 |
| 20/08/2019 | 5.1 |
| 20/08/2019 | 5.2 |
| 20/08/2019 | 5.1 |
| 20/08/2019 | 6 |
| 20/08/2019 | 6.5 |
| 20/08/2019 | 6.6 |
| 20/08/2019 | 10.5 |
| 20/08/2019 | 26.9 |
| 20/08/2019 | 24 |
| 20/08/2019 | 19.3 |
| 20/08/2019 | 18.6 |
| 21/08/2019 | 14.2 |
| 21/08/2019 | 11.2 |
| 21/08/2019 | 10.7 |
| 21/08/2019 | 10.3 |
| 21/08/2019 | 9.8 |
| 21/08/2019 | 11.2 |
| 21/08/2019 | 11.1 |
| 21/08/2019 | 12.5 |
| 21/08/2019 | 11.3 |
| 21/08/2019 | 8.1 |
| 21/08/2019 | 6.5 |
| 21/08/2019 | 5.9 |
| 21/08/2019 | 6.4 |
| 21/08/2019 | 6.3 |
| 21/08/2019 | 6.4 |
| 21/08/2019 | 6.1 |
| 21/08/2019 | 7.3 |
| 21/08/2019 | 7.8 |
| 21/08/2019 | 7.8 |
| 21/08/2019 | 10.4 |
| 21/08/2019 | 11.6 |
| 21/08/2019 | 9.1 |
| 21/08/2019 | 9.9 |
| 21/08/2019 | 10.2 |
| 22/08/2019 | 7.5 |
| 22/08/2019 | 8.1 |
| 22/08/2019 | 7.5 |
| 22/08/2019 | 5.8 |
| 22/08/2019 | 4.9 |
| 22/08/2019 | 4.3 |
| 22/08/2019 | 4.5 |
| 22/08/2019 | 5.1 |
| 22/08/2019 | 6 |
| 22/08/2019 | 6.5 |
| 22/08/2019 | 7 |
| 22/08/2019 | 7.3 |
| 22/08/2019 | 7.5 |
| 22/08/2019 | 7.8 |
| 22/08/2019 | 7.3 |
| 22/08/2019 | 7.2 |
| 22/08/2019 | 7.6 |
| 22/08/2019 | 7.3 |
| 22/08/2019 | 9.1 |
| 22/08/2019 | 8.3 |
| 22/08/2019 | 8.9 |
| 22/08/2019 | 8.8 |
| 22/08/2019 | 8.3 |
| 22/08/2019 | 7.8 |
| 23/08/2019 | 7.2 |
| 23/08/2019 | 6.8 |
| 23/08/2019 | 6.7 |
| 23/08/2019 | 6.7 |
| 23/08/2019 | 6.3 |
| 23/08/2019 | 6.3 |
| 23/08/2019 | 6.8 |
| 23/08/2019 | 6.6 |
| 23/08/2019 | 6.6 |
| 23/08/2019 | 8.2 |
| 23/08/2019 | 9.5 |
| 23/08/2019 | 11.7 |
| 23/08/2019 | 12.1 |
| 23/08/2019 | 12.3 |
| 23/08/2019 | 11.5 |
| 23/08/2019 | 11.9 |
| 23/08/2019 | 8.2 |
| 23/08/2019 | 7.7 |
| 23/08/2019 | 9.9 |
| 23/08/2019 | 9 |
| 23/08/2019 | 7.4 |
| 23/08/2019 | 7.6 |
| 23/08/2019 | 7.3 |
| 23/08/2019 | 7.8 |
| 24/08/2019 | 7.3 |
| 24/08/2019 | 7.1 |
| 24/08/2019 | 7.1 |
| 24/08/2019 | 6.8 |
| 24/08/2019 | 6.8 |
| 24/08/2019 | 6.9 |
| 24/08/2019 | 8.2 |
| 24/08/2019 | 8.5 |
| 24/08/2019 | 7.4 |
| 24/08/2019 | 7.2 |
| 24/08/2019 | 6.3 |
| 24/08/2019 | 3.4 |
| 24/08/2019 | 2.9 |
| 24/08/2019 | 3.3 |
| 24/08/2019 | 4.7 |
| 24/08/2019 | 5 |
| 24/08/2019 | 5 |
| 24/08/2019 | 9 |
| 24/08/2019 | 5.5 |
| 24/08/2019 | 5.7 |
| 24/08/2019 | 6.3 |
| 24/08/2019 | 5.7 |
| 24/08/2019 | 4.3 |
| 24/08/2019 | 4.9 |
| 25/08/2019 | 5.4 |
| 25/08/2019 | 4.9 |
| 25/08/2019 | 5.1 |
| 25/08/2019 | 4.7 |
| 25/08/2019 | 5 |
| 25/08/2019 | 5.7 |
| 25/08/2019 | 6.1 |
| 25/08/2019 | 6.5 |
| 25/08/2019 | 6.7 |
| 25/08/2019 | 6.8 |
| 25/08/2019 | 6.1 |
| 25/08/2019 | 5.4 |
| 25/08/2019 | 3.7 |
| 25/08/2019 | 3.7 |
| 25/08/2019 | 3.8 |
| 25/08/2019 | 4.6 |
| 25/08/2019 | 5.1 |
| 25/08/2019 | 4.3 |
| 25/08/2019 | 3.8 |
| 25/08/2019 | 3 |
| 25/08/2019 | 3.3 |
| 25/08/2019 | 2.8 |
| 25/08/2019 | 3.5 |
| 25/08/2019 | 3.6 |
| 26/08/2019 | 3.7 |
| 26/08/2019 | 3.7 |
| 26/08/2019 | 3.6 |
| 26/08/2019 | 3.7 |
| 26/08/2019 | 3.7 |
| 26/08/2019 | 3.1 |
| 26/08/2019 | 2.9 |
| 26/08/2019 | 2.9 |
| 26/08/2019 | 3.3 |
| 26/08/2019 | 3.1 |
| 26/08/2019 | 3.5 |
| 26/08/2019 | 3.8 |
| 26/08/2019 | 3.8 |
| 26/08/2019 | 3.6 |
| 26/08/2019 | 3.5 |
| 26/08/2019 | 4.1 |
| 26/08/2019 | 3.6 |
| 26/08/2019 | 3.4 |
| 26/08/2019 | 3.6 |
| 26/08/2019 | 4.4 |
| 26/08/2019 | 4.4 |
| 26/08/2019 | 4.6 |
| 26/08/2019 | 4.3 |
| 26/08/2019 | 4 |
| 27/08/2019 | 3.7 |
| 27/08/2019 | 3 |
| 27/08/2019 | 3.1 |
| 27/08/2019 | 3.2 |
| 27/08/2019 | 3.3 |
| 27/08/2019 | 3.1 |
| 27/08/2019 | 3.3 |
| 27/08/2019 | 3.5 |
| 27/08/2019 | 3.4 |
| 27/08/2019 | 3.4 |
| 27/08/2019 | 3.3 |
| 27/08/2019 | 3.2 |
| 27/08/2019 | 2.6 |
| 27/08/2019 | 2.7 |
| 27/08/2019 | 2.4 |
| 27/08/2019 | 2.6 |
| 27/08/2019 | 3.2 |
| 27/08/2019 | 3.3 |
| 27/08/2019 | 3.1 |
| 27/08/2019 | 3 |
| 27/08/2019 | 3.6 |
| 27/08/2019 | 4.2 |
| 27/08/2019 | 2.8 |
| 27/08/2019 | 3.3 |
| 28/08/2019 | 3.4 |
| 28/08/2019 | 3.3 |
| 28/08/2019 | 3.4 |
| 28/08/2019 | 3.6 |
| 28/08/2019 | 3.8 |
| 28/08/2019 | 4.4 |
| 28/08/2019 | 4 |
| 28/08/2019 | 4 |
| 28/08/2019 | 3.8 |
| 28/08/2019 | 4.1 |
| 28/08/2019 | 4.4 |
| 28/08/2019 | 3.8 |
| 28/08/2019 | 4.1 |
| 28/08/2019 | 4.8 |
| 28/08/2019 | 4.5 |
| 28/08/2019 | 4.9 |
| 28/08/2019 | 5.7 |
| 28/08/2019 | 7.3 |
| 28/08/2019 | 4.2 |
| 28/08/2019 | 3.6 |
| 28/08/2019 | 5.7 |
| 28/08/2019 | 6.5 |
| 28/08/2019 | 6.9 |
| 28/08/2019 | 4.2 |
| 29/08/2019 | 3.8 |
| 29/08/2019 | 3.7 |
| 29/08/2019 | 3.5 |
| 29/08/2019 | 3.5 |
| 29/08/2019 | 3.3 |
| 29/08/2019 | 3.4 |
| 29/08/2019 | 3.5 |
| 29/08/2019 | 4 |
| 29/08/2019 | 4.4 |
| 29/08/2019 | 4 |
| 29/08/2019 | 3.3 |
| 29/08/2019 | 3.3 |
| 29/08/2019 | 3.7 |
| 29/08/2019 | 3.3 |
| 29/08/2019 | 3.5 |
| 29/08/2019 | 3.7 |
| 29/08/2019 | 4.1 |
| 29/08/2019 | 4 |
| 29/08/2019 | 4.8 |
| 29/08/2019 | 5 |
| 29/08/2019 | 6.3 |
| 29/08/2019 | 7.8 |
| 29/08/2019 | 8.8 |
| 29/08/2019 | 12.8 |
| 30/08/2019 | 11.8 |
| 30/08/2019 | 13.9 |
| 30/08/2019 | 14.5 |
| 30/08/2019 | 17.4 |
| 30/08/2019 | 14 |
| 30/08/2019 | 14.4 |
| 30/08/2019 | 13.2 |
| 30/08/2019 | 14.8 |
| 30/08/2019 | 13.8 |
| 30/08/2019 | 10.4 |
| 30/08/2019 | 8.7 |
| 30/08/2019 | 6.8 |
| 30/08/2019 | 5.7 |
| 30/08/2019 | 4.7 |
| 30/08/2019 | 4.4 |
| 30/08/2019 | 6.2 |
| 30/08/2019 | 6.2 |
| 30/08/2019 | 11.6 |
| 30/08/2019 | 6.8 |
| 30/08/2019 | 9.9 |
| 30/08/2019 | 7.1 |
| 30/08/2019 | 6.7 |
| 30/08/2019 | 8 |
| 30/08/2019 | 7 |
| 31/08/2019 | 5.4 |
| 31/08/2019 | 5.3 |
| 31/08/2019 | 6.6 |
| 31/08/2019 | 6.4 |
| 31/08/2019 | 6.3 |
| 31/08/2019 | 6.1 |
| 31/08/2019 | 6 |
| 31/08/2019 | 6.2 |
| 31/08/2019 | 6.2 |
| 31/08/2019 | 5.3 |
| 31/08/2019 | 4.3 |
| 31/08/2019 | 4 |
| 31/08/2019 | 4 |
| 31/08/2019 | 4.2 |
| 31/08/2019 | 4.5 |
| 31/08/2019 | 5.3 |
| 31/08/2019 | 6.1 |
| 31/08/2019 | 5.3 |
| 31/08/2019 | 7 |
| 31/08/2019 | 7.1 |
| 31/08/2019 | 8.3 |
| 31/08/2019 | 5.9 |
| 31/08/2019 | 6.1 |
| 31/08/2019 | 5.9 |